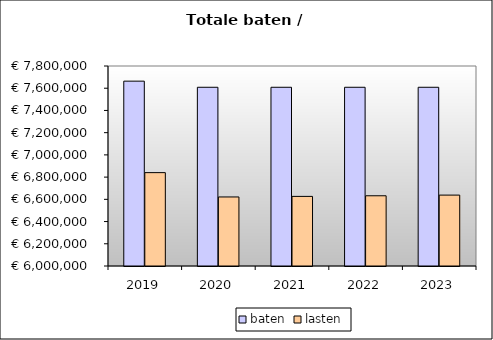
| Category | baten | lasten |
|---|---|---|
| 2019.0 | 7663691.883 | 6840316.475 |
| 2020.0 | 7608505.886 | 6621291.81 |
| 2021.0 | 7608505.886 | 6626399.99 |
| 2022.0 | 7608505.886 | 6631977.87 |
| 2023.0 | 7608505.886 | 6638020.83 |